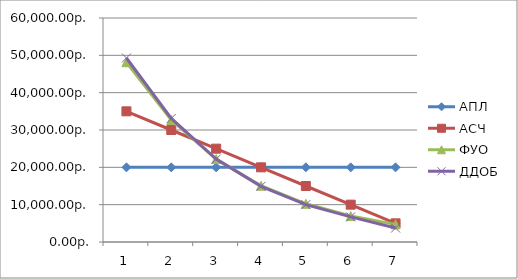
| Category | АПЛ | АСЧ | ФУО | ДДОБ |
|---|---|---|---|---|
| 0 | 20000 | 35000 | 48150 | 49285.714 |
| 1 | 20000 | 30000 | 32693.85 | 33091.837 |
| 2 | 20000 | 25000 | 22199.124 | 22218.805 |
| 3 | 20000 | 20000 | 15073.205 | 14918.34 |
| 4 | 20000 | 15000 | 10234.706 | 10016.6 |
| 5 | 20000 | 10000 | 6949.366 | 6725.431 |
| 6 | 20000 | 5000 | 4718.619 | 3743.273 |